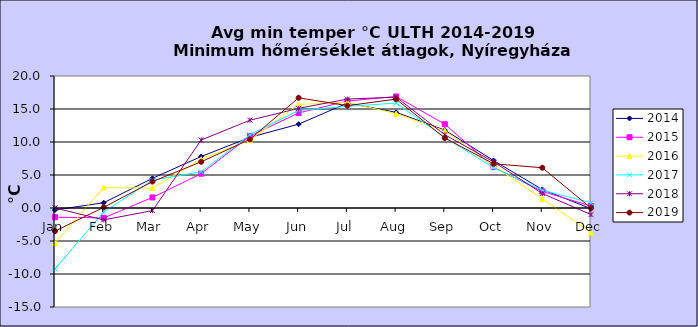
| Category | 2014 | 2015 | 2016 | 2017 | 2018 | 2019 |
|---|---|---|---|---|---|---|
| Jan | -0.3 | -1.4 | -5.3 | -9.2 | 0 | -3.5 |
| Feb | 0.8 | -1.5 | 3.1 | -0.6 | -1.8 | 0.1 |
| Mar | 4.5 | 1.6 | 3 | 4.2 | -0.4 | 4 |
| Apr | 7.8 | 5.2 | 7.4 | 5.5 | 10.3 | 7 |
| May | 10.7 | 10.9 | 10.3 | 11.1 | 13.3 | 10.4 |
| Jun | 12.7 | 14.4 | 15.7 | 14.8 | 15.1 | 16.7 |
| Jul | 15.9 | 16.2 | 16 | 15.4 | 16.5 | 15.5 |
| Aug | 14.5 | 16.9 | 14.3 | 15.9 | 16.8 | 16.5 |
| Sep | 11.8 | 12.7 | 11.7 | 10.7 | 11.1 | 10.6 |
| Oct | 7.2 | 6.2 | 6.4 | 6.1 | 7 | 6.7 |
| Nov | 2.8 | 2.5 | 1.4 | 2.7 | 2.2 | 6.1 |
| Dec | -0.1 | 0.3 | -3.7 | 0.8 | -1 | 0 |